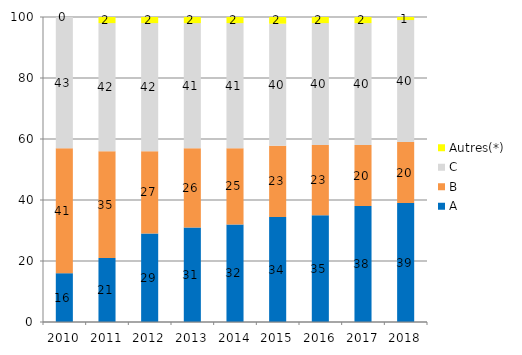
| Category | A | B | C | Autres(*) |
|---|---|---|---|---|
| 2010.0 | 16 | 41 | 43 | 0 |
| 2011.0 | 21 | 35 | 42 | 2 |
| 2012.0 | 29 | 27 | 42 | 2 |
| 2013.0 | 31 | 26 | 41 | 2 |
| 2014.0 | 32 | 25 | 41 | 2 |
| 2015.0 | 34.4 | 23.4 | 40 | 2.2 |
| 2016.0 | 35 | 23 | 40 | 2 |
| 2017.0 | 38 | 20 | 40 | 2 |
| 2018.0 | 39 | 20 | 40 | 1 |